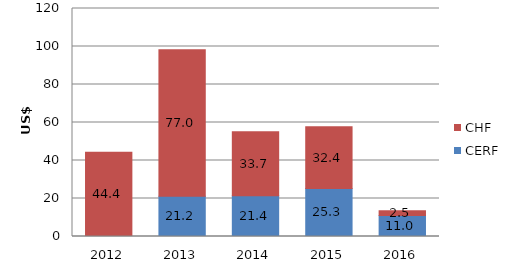
| Category | CERF | CHF |
|---|---|---|
| 2012.0 | 0 | 44.406 |
| 2013.0 | 21.203 | 77.023 |
| 2014.0 | 21.444 | 33.747 |
| 2015.0 | 25.289 | 32.412 |
| 2016.0 | 11.006 | 2.506 |